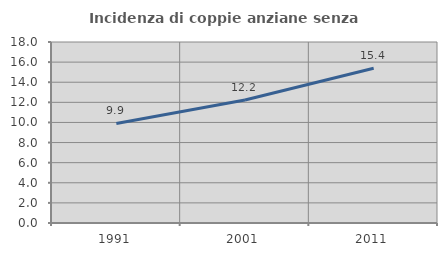
| Category | Incidenza di coppie anziane senza figli  |
|---|---|
| 1991.0 | 9.898 |
| 2001.0 | 12.238 |
| 2011.0 | 15.385 |